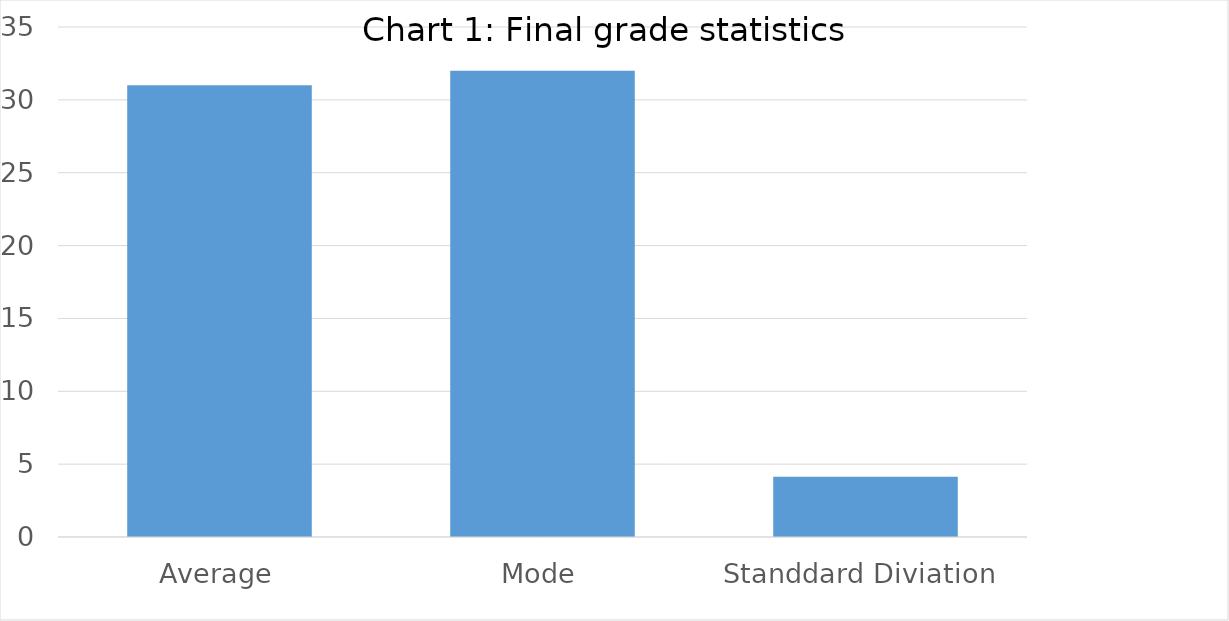
| Category | Series 0 |
|---|---|
| Average | 31 |
| Mode | 32 |
| Standdard Diviation  | 4.137 |